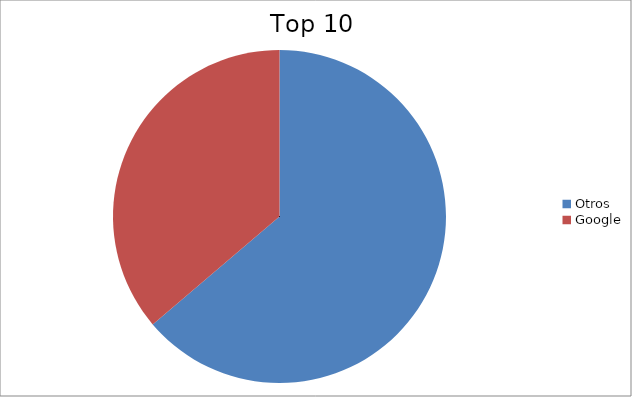
| Category | Series 0 |
|---|---|
| Otros | 63.78 |
| Google | 36.22 |